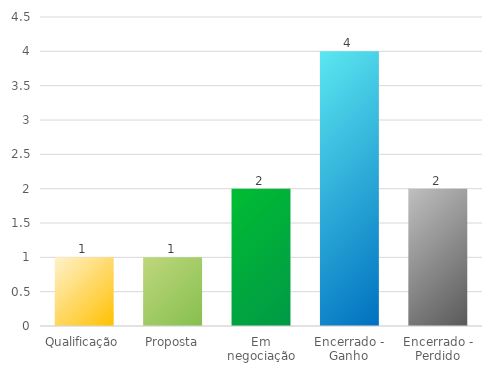
| Category | Series 0 |
|---|---|
| Qualificação | 1 |
| Proposta | 1 |
| Em negociação | 2 |
| Encerrado - Ganho | 4 |
| Encerrado - Perdido | 2 |